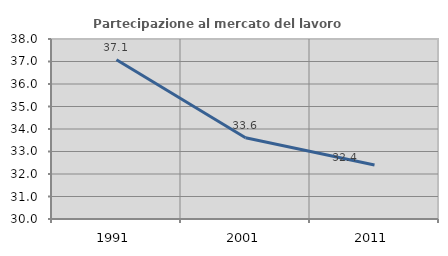
| Category | Partecipazione al mercato del lavoro  femminile |
|---|---|
| 1991.0 | 37.078 |
| 2001.0 | 33.608 |
| 2011.0 | 32.403 |